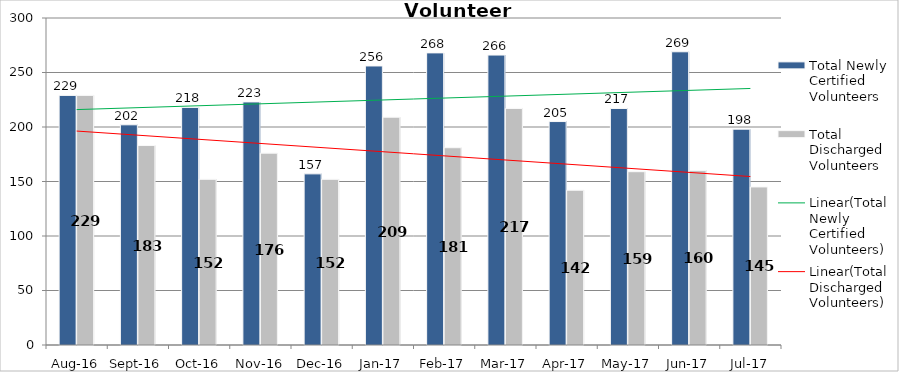
| Category | Total Newly Certified Volunteers | Total Discharged Volunteers |
|---|---|---|
| Aug-16 | 229 | 229 |
| Sep-16 | 202 | 183 |
| Oct-16 | 218 | 152 |
| Nov-16 | 223 | 176 |
| Dec-16 | 157 | 152 |
| Jan-17 | 256 | 209 |
| Feb-17 | 268 | 181 |
| Mar-17 | 266 | 217 |
| Apr-17 | 205 | 142 |
| May-17 | 217 | 159 |
| Jun-17 | 269 | 160 |
| Jul-17 | 198 | 145 |